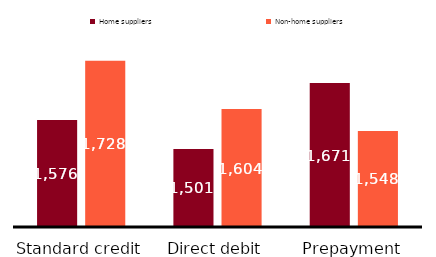
| Category | Home suppliers | Non-home suppliers |
|---|---|---|
| Standard credit | 1575.748 | 1728.464 |
| Direct debit | 1501.228 | 1604.035 |
| Prepayment | 1671.085 | 1547.552 |